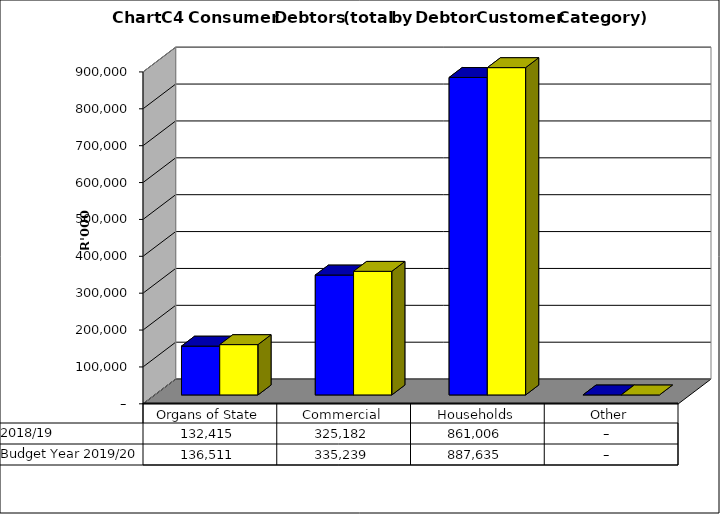
| Category |  2018/19  | Budget Year 2019/20 |
|---|---|---|
| Organs of State | 132415221.86 | 136510538 |
| Commercial | 325182124.88 | 335239304 |
| Households | 861006433.06 | 887635498 |
| Other | 0 | 0 |